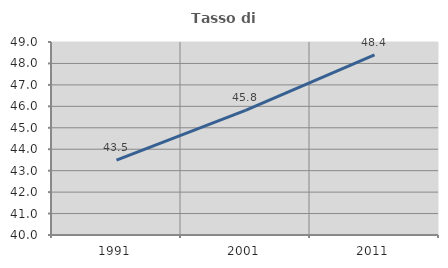
| Category | Tasso di occupazione   |
|---|---|
| 1991.0 | 43.487 |
| 2001.0 | 45.809 |
| 2011.0 | 48.403 |